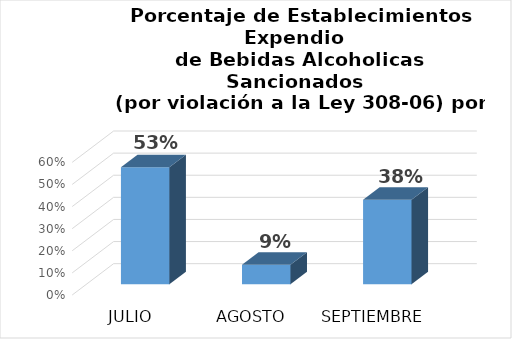
| Category | Series 0 |
|---|---|
| JULIO | 0.529 |
| AGOSTO | 0.088 |
| SEPTIEMBRE | 0.382 |